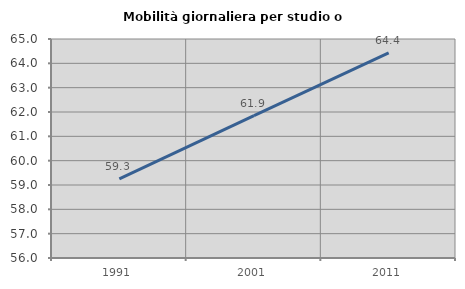
| Category | Mobilità giornaliera per studio o lavoro |
|---|---|
| 1991.0 | 59.25 |
| 2001.0 | 61.85 |
| 2011.0 | 64.432 |